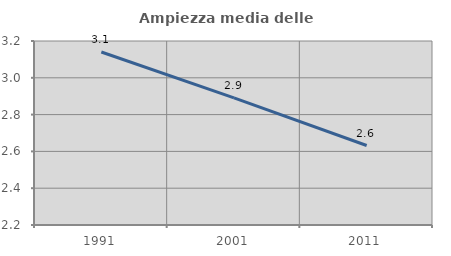
| Category | Ampiezza media delle famiglie |
|---|---|
| 1991.0 | 3.14 |
| 2001.0 | 2.89 |
| 2011.0 | 2.632 |